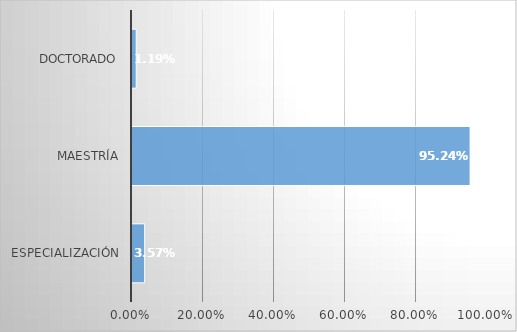
| Category | Series 0 |
|---|---|
| Especialización | 0.036 |
| Maestría | 0.952 |
| Doctorado | 0.012 |